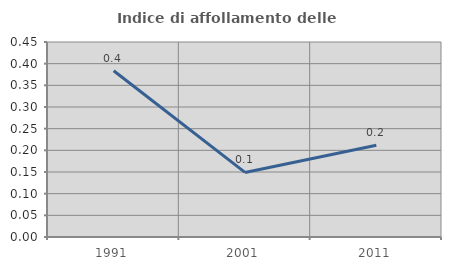
| Category | Indice di affollamento delle abitazioni  |
|---|---|
| 1991.0 | 0.384 |
| 2001.0 | 0.149 |
| 2011.0 | 0.212 |